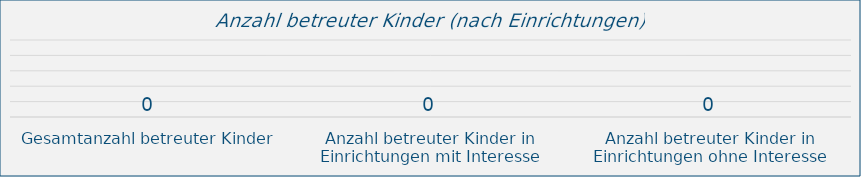
| Category | Series 0 |
|---|---|
| Gesamtanzahl betreuter Kinder | 0 |
| Anzahl betreuter Kinder in Einrichtungen mit Interesse | 0 |
| Anzahl betreuter Kinder in Einrichtungen ohne Interesse | 0 |